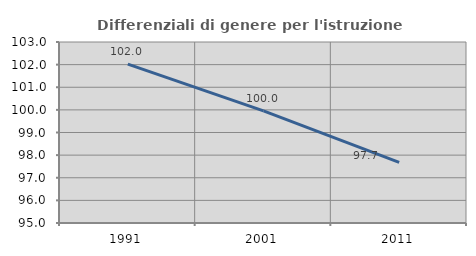
| Category | Differenziali di genere per l'istruzione superiore |
|---|---|
| 1991.0 | 102.021 |
| 2001.0 | 99.954 |
| 2011.0 | 97.683 |